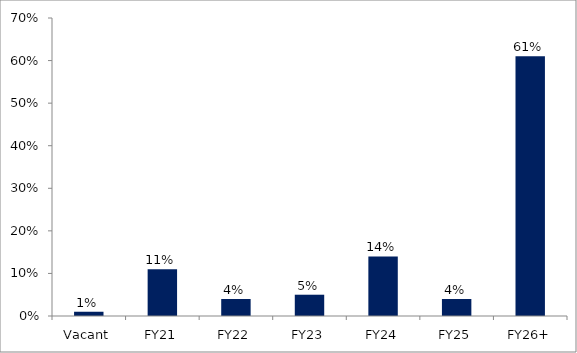
| Category | Series 0 |
|---|---|
| Vacant | 0.01 |
| FY21 | 0.11 |
| FY22 | 0.04 |
| FY23 | 0.05 |
| FY24 | 0.14 |
| FY25 | 0.04 |
| FY26+ | 0.61 |